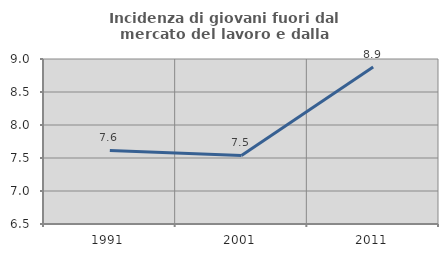
| Category | Incidenza di giovani fuori dal mercato del lavoro e dalla formazione  |
|---|---|
| 1991.0 | 7.615 |
| 2001.0 | 7.539 |
| 2011.0 | 8.88 |